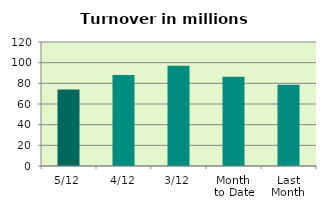
| Category | Series 0 |
|---|---|
| 5/12 | 74.015 |
| 4/12 | 88.033 |
| 3/12 | 97.116 |
| Month 
to Date | 86.388 |
| Last
Month | 78.658 |